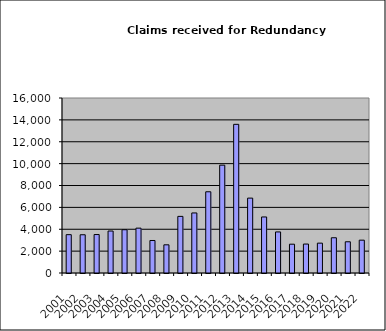
| Category | Series 0 |
|---|---|
| 2001.0 | 3505 |
| 2002.0 | 3497 |
| 2003.0 | 3516 |
| 2004.0 | 3838 |
| 2005.0 | 3956 |
| 2006.0 | 4101 |
| 2007.0 | 2972 |
| 2008.0 | 2577 |
| 2009.0 | 5177 |
| 2010.0 | 5491 |
| 2011.0 | 7426 |
| 2012.0 | 9860 |
| 2013.0 | 13592 |
| 2014.0 | 6846 |
| 2015.0 | 5123 |
| 2016.0 | 3755 |
| 2017.0 | 2634 |
| 2018.0 | 2647 |
| 2019.0 | 2729 |
| 2020.0 | 3222 |
| 2021.0 | 2855 |
| 2022.0 | 3002 |